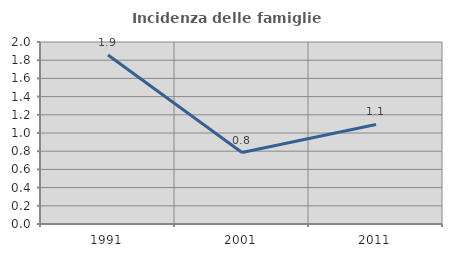
| Category | Incidenza delle famiglie numerose |
|---|---|
| 1991.0 | 1.857 |
| 2001.0 | 0.785 |
| 2011.0 | 1.094 |